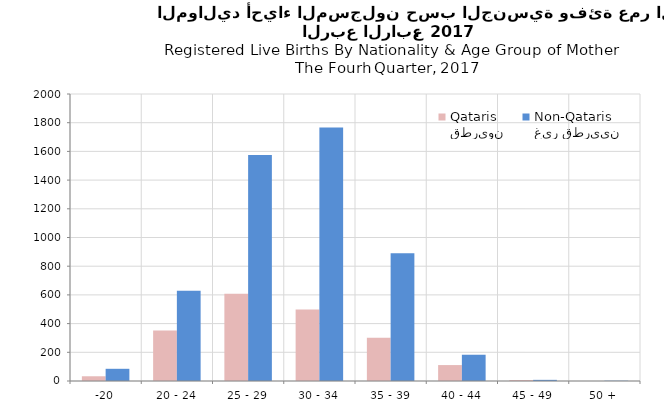
| Category | قطريون
Qataris | غير قطريين
Non-Qataris |
|---|---|---|
| -20 | 33 | 85 |
| 20 - 24 | 352 | 629 |
| 25 - 29 | 608 | 1575 |
| 30 - 34 | 499 | 1767 |
| 35 - 39 | 302 | 891 |
| 40 - 44 | 111 | 183 |
| 45 - 49 | 7 | 8 |
| 50 + | 0 | 2 |